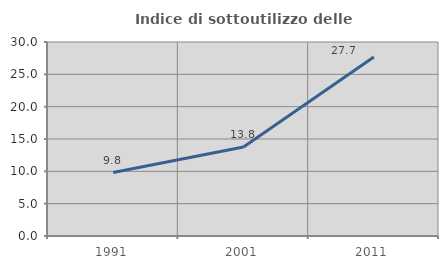
| Category | Indice di sottoutilizzo delle abitazioni  |
|---|---|
| 1991.0 | 9.805 |
| 2001.0 | 13.768 |
| 2011.0 | 27.665 |